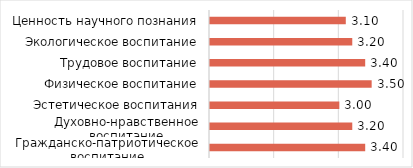
| Category | Series 2 |
|---|---|
| Гражданско-патриотическое воспитание | 3.4 |
| Духовно-нравственное воспитание | 3.2 |
| Эстетическое воспитания | 3 |
| Физическое воспитание | 3.5 |
| Трудовое воспитание | 3.4 |
| Экологическое воспитание | 3.2 |
| Ценность научного познания | 3.1 |